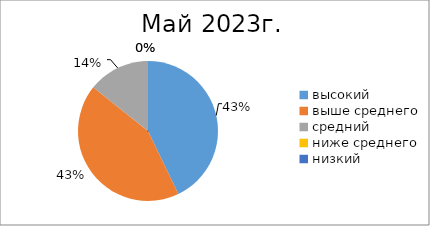
| Category | Series 1 | Series 0 |
|---|---|---|
| высокий | 6 | 3 |
| выше среднего | 6 | 6 |
| средний | 2 | 6 |
| ниже среднего | 0 | 0 |
| низкий | 0 | 0 |